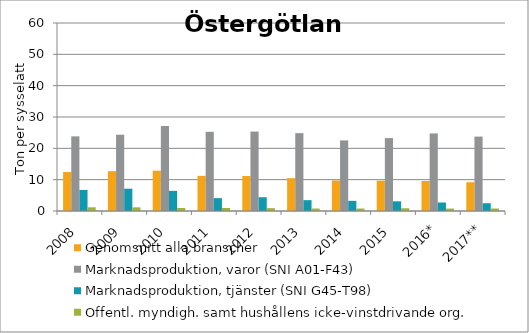
| Category | Genomsnitt alla branscher | Marknadsproduktion, varor (SNI A01-F43) | Marknadsproduktion, tjänster (SNI G45-T98) | Offentl. myndigh. samt hushållens icke-vinstdrivande org. |
|---|---|---|---|---|
| 2008 | 12.435 | 23.823 | 6.715 | 1.184 |
| 2009 | 12.7 | 24.345 | 7.12 | 1.175 |
| 2010 | 12.872 | 27.16 | 6.434 | 0.96 |
| 2011 | 11.212 | 25.275 | 4.105 | 0.967 |
| 2012 | 11.179 | 25.34 | 4.394 | 0.912 |
| 2013 | 10.479 | 24.849 | 3.463 | 0.792 |
| 2014 | 9.738 | 22.531 | 3.244 | 0.793 |
| 2015 | 9.668 | 23.268 | 3.093 | 0.872 |
| 2016* | 9.579 | 24.756 | 2.706 | 0.772 |
| 2017** | 9.183 | 23.746 | 2.487 | 0.794 |